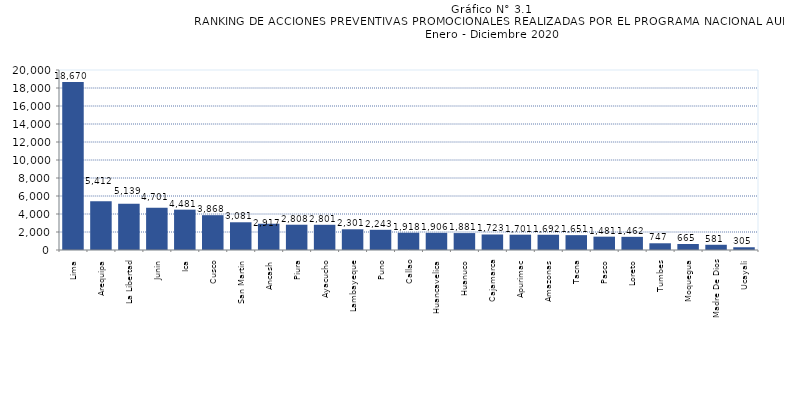
| Category | Series 0 |
|---|---|
| Lima | 18670 |
| Arequipa | 5412 |
| La Libertad | 5139 |
| Junin | 4701 |
| Ica | 4481 |
| Cusco | 3868 |
| San Martin | 3081 |
| Ancash | 2917 |
| Piura | 2808 |
| Ayacucho | 2801 |
| Lambayeque | 2301 |
| Puno | 2243 |
| Callao | 1918 |
| Huancavelica | 1906 |
| Huanuco | 1881 |
| Cajamarca | 1723 |
| Apurimac | 1701 |
| Amazonas | 1692 |
| Tacna | 1651 |
| Pasco | 1481 |
| Loreto | 1462 |
| Tumbes | 747 |
| Moquegua | 665 |
| Madre De Dios | 581 |
| Ucayali | 305 |